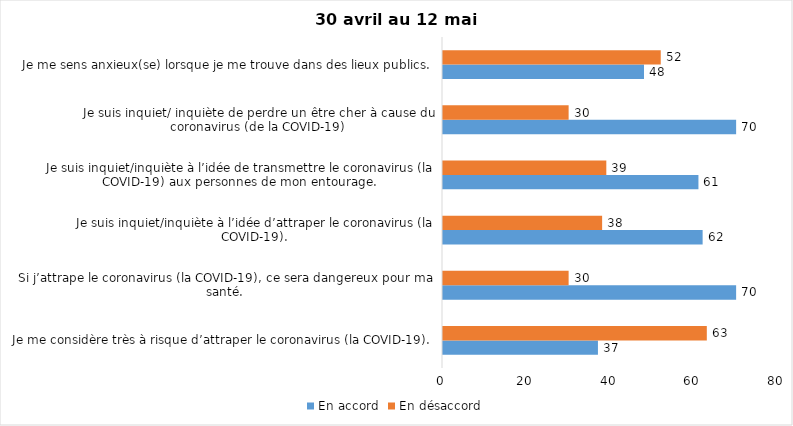
| Category | En accord | En désaccord |
|---|---|---|
| Je me considère très à risque d’attraper le coronavirus (la COVID-19). | 37 | 63 |
| Si j’attrape le coronavirus (la COVID-19), ce sera dangereux pour ma santé. | 70 | 30 |
| Je suis inquiet/inquiète à l’idée d’attraper le coronavirus (la COVID-19). | 62 | 38 |
| Je suis inquiet/inquiète à l’idée de transmettre le coronavirus (la COVID-19) aux personnes de mon entourage. | 61 | 39 |
| Je suis inquiet/ inquiète de perdre un être cher à cause du coronavirus (de la COVID-19) | 70 | 30 |
| Je me sens anxieux(se) lorsque je me trouve dans des lieux publics. | 48 | 52 |